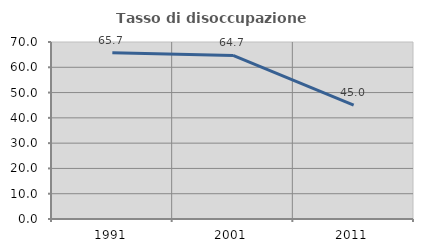
| Category | Tasso di disoccupazione giovanile  |
|---|---|
| 1991.0 | 65.714 |
| 2001.0 | 64.706 |
| 2011.0 | 45 |